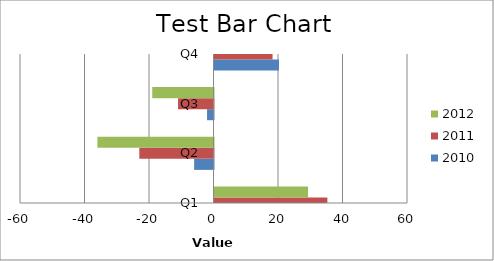
| Category | 2010 | 2011 | 2012 |
|---|---|---|---|
| Q1 | 38 | 35 | 29 |
| Q2 | -6 | -23 | -36 |
| Q3 | -2 | -11 | -19 |
| Q4 | 20 | 18 | 50 |